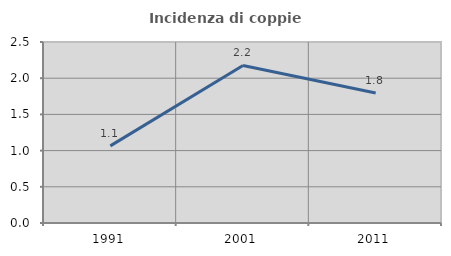
| Category | Incidenza di coppie miste |
|---|---|
| 1991.0 | 1.065 |
| 2001.0 | 2.176 |
| 2011.0 | 1.795 |